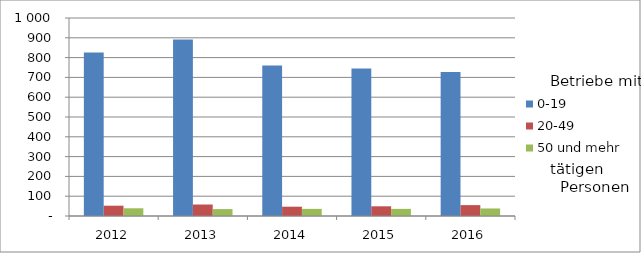
| Category | 0-19 | 20-49 | 50 und mehr |
|---|---|---|---|
| 2012.0 | 826 | 52 | 39 |
| 2013.0 | 891 | 58 | 35 |
| 2014.0 | 760 | 47 | 36 |
| 2015.0 | 745 | 49 | 36 |
| 2016.0 | 727 | 55 | 38 |